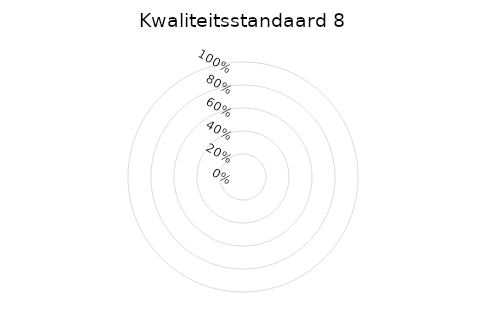
| Category | 8a | 8b | 8d | 8e | 8f | 8g | 8h | 8i | 8j |
|---|---|---|---|---|---|---|---|---|---|
| 0.0 | 0 | 0 | 0 | 0 | 0 | 0 | 0 | 0 | 0 |
| 1.0 | 0 | 0 | 0 | 0 | 0 | 0 | 0 | 0 | 0 |
| 2.0 | 0 | 0 | 0 | 0 | 0 | 0 | 0 | 0 | 0 |
| 3.0 | 0 | 0 | 0 | 0 | 0 | 0 | 0 | 0 | 0 |
| 4.0 | 0 | 0 | 0 | 0 | 0 | 0 | 0 | 0 | 0 |
| 5.0 | 0 | 0 | 0 | 0 | 0 | 0 | 0 | 0 | 0 |
| 6.0 | 0 | 0 | 0 | 0 | 0 | 0 | 0 | 0 | 0 |
| 7.0 | 0 | 0 | 0 | 0 | 0 | 0 | 0 | 0 | 0 |
| 8.0 | 0 | 0 | 0 | 0 | 0 | 0 | 0 | 0 | 0 |
| 9.0 | 0 | 0 | 0 | 0 | 0 | 0 | 0 | 0 | 0 |
| 10.0 | 0 | 0 | 0 | 0 | 0 | 0 | 0 | 0 | 0 |
| 11.0 | 0 | 0 | 0 | 0 | 0 | 0 | 0 | 0 | 0 |
| 12.0 | 0 | 0 | 0 | 0 | 0 | 0 | 0 | 0 | 0 |
| 13.0 | 0 | 0 | 0 | 0 | 0 | 0 | 0 | 0 | 0 |
| 14.0 | 0 | 0 | 0 | 0 | 0 | 0 | 0 | 0 | 0 |
| 15.0 | 0 | 0 | 0 | 0 | 0 | 0 | 0 | 0 | 0 |
| 16.0 | 0 | 0 | 0 | 0 | 0 | 0 | 0 | 0 | 0 |
| 17.0 | 0 | 0 | 0 | 0 | 0 | 0 | 0 | 0 | 0 |
| 18.0 | 0 | 0 | 0 | 0 | 0 | 0 | 0 | 0 | 0 |
| 19.0 | 0 | 0 | 0 | 0 | 0 | 0 | 0 | 0 | 0 |
| 20.0 | 0 | 0 | 0 | 0 | 0 | 0 | 0 | 0 | 0 |
| 21.0 | 0 | 0 | 0 | 0 | 0 | 0 | 0 | 0 | 0 |
| 22.0 | 0 | 0 | 0 | 0 | 0 | 0 | 0 | 0 | 0 |
| 23.0 | 0 | 0 | 0 | 0 | 0 | 0 | 0 | 0 | 0 |
| 24.0 | 0 | 0 | 0 | 0 | 0 | 0 | 0 | 0 | 0 |
| 25.0 | 0 | 0 | 0 | 0 | 0 | 0 | 0 | 0 | 0 |
| 26.0 | 0 | 0 | 0 | 0 | 0 | 0 | 0 | 0 | 0 |
| 27.0 | 0 | 0 | 0 | 0 | 0 | 0 | 0 | 0 | 0 |
| 28.0 | 0 | 0 | 0 | 0 | 0 | 0 | 0 | 0 | 0 |
| 29.0 | 0 | 0 | 0 | 0 | 0 | 0 | 0 | 0 | 0 |
| 30.0 | 0 | 0 | 0 | 0 | 0 | 0 | 0 | 0 | 0 |
| 31.0 | 0 | 0 | 0 | 0 | 0 | 0 | 0 | 0 | 0 |
| 32.0 | 0 | 0 | 0 | 0 | 0 | 0 | 0 | 0 | 0 |
| 33.0 | 0 | 0 | 0 | 0 | 0 | 0 | 0 | 0 | 0 |
| 34.0 | 0 | 0 | 0 | 0 | 0 | 0 | 0 | 0 | 0 |
| 35.0 | 0 | 0 | 0 | 0 | 0 | 0 | 0 | 0 | 0 |
| 36.0 | 0 | 0 | 0 | 0 | 0 | 0 | 0 | 0 | 0 |
| 37.0 | 0 | 0 | 0 | 0 | 0 | 0 | 0 | 0 | 0 |
| 38.0 | 0 | 0 | 0 | 0 | 0 | 0 | 0 | 0 | 0 |
| 39.0 | 0 | 0 | 0 | 0 | 0 | 0 | 0 | 0 | 0 |
| 40.0 | 0 | 0 | 0 | 0 | 0 | 0 | 0 | 0 | 0 |
| 41.0 | 0 | 0 | 0 | 0 | 0 | 0 | 0 | 0 | 0 |
| 42.0 | 0 | 0 | 0 | 0 | 0 | 0 | 0 | 0 | 0 |
| 43.0 | 0 | 0 | 0 | 0 | 0 | 0 | 0 | 0 | 0 |
| 44.0 | 0 | 0 | 0 | 0 | 0 | 0 | 0 | 0 | 0 |
| 45.0 | 0 | 0 | 0 | 0 | 0 | 0 | 0 | 0 | 0 |
| 46.0 | 0 | 0 | 0 | 0 | 0 | 0 | 0 | 0 | 0 |
| 47.0 | 0 | 0 | 0 | 0 | 0 | 0 | 0 | 0 | 0 |
| 48.0 | 0 | 0 | 0 | 0 | 0 | 0 | 0 | 0 | 0 |
| 49.0 | 0 | 0 | 0 | 0 | 0 | 0 | 0 | 0 | 0 |
| 50.0 | 0 | 0 | 0 | 0 | 0 | 0 | 0 | 0 | 0 |
| 51.0 | 0 | 0 | 0 | 0 | 0 | 0 | 0 | 0 | 0 |
| 52.0 | 0 | 0 | 0 | 0 | 0 | 0 | 0 | 0 | 0 |
| 53.0 | 0 | 0 | 0 | 0 | 0 | 0 | 0 | 0 | 0 |
| 54.0 | 0 | 0 | 0 | 0 | 0 | 0 | 0 | 0 | 0 |
| 55.0 | 0 | 0 | 0 | 0 | 0 | 0 | 0 | 0 | 0 |
| 56.0 | 0 | 0 | 0 | 0 | 0 | 0 | 0 | 0 | 0 |
| 57.0 | 0 | 0 | 0 | 0 | 0 | 0 | 0 | 0 | 0 |
| 58.0 | 0 | 0 | 0 | 0 | 0 | 0 | 0 | 0 | 0 |
| 59.0 | 0 | 0 | 0 | 0 | 0 | 0 | 0 | 0 | 0 |
| 60.0 | 0 | 0 | 0 | 0 | 0 | 0 | 0 | 0 | 0 |
| 61.0 | 0 | 0 | 0 | 0 | 0 | 0 | 0 | 0 | 0 |
| 62.0 | 0 | 0 | 0 | 0 | 0 | 0 | 0 | 0 | 0 |
| 63.0 | 0 | 0 | 0 | 0 | 0 | 0 | 0 | 0 | 0 |
| 64.0 | 0 | 0 | 0 | 0 | 0 | 0 | 0 | 0 | 0 |
| 65.0 | 0 | 0 | 0 | 0 | 0 | 0 | 0 | 0 | 0 |
| 66.0 | 0 | 0 | 0 | 0 | 0 | 0 | 0 | 0 | 0 |
| 67.0 | 0 | 0 | 0 | 0 | 0 | 0 | 0 | 0 | 0 |
| 68.0 | 0 | 0 | 0 | 0 | 0 | 0 | 0 | 0 | 0 |
| 69.0 | 0 | 0 | 0 | 0 | 0 | 0 | 0 | 0 | 0 |
| 70.0 | 0 | 0 | 0 | 0 | 0 | 0 | 0 | 0 | 0 |
| 71.0 | 0 | 0 | 0 | 0 | 0 | 0 | 0 | 0 | 0 |
| 72.0 | 0 | 0 | 0 | 0 | 0 | 0 | 0 | 0 | 0 |
| 73.0 | 0 | 0 | 0 | 0 | 0 | 0 | 0 | 0 | 0 |
| 74.0 | 0 | 0 | 0 | 0 | 0 | 0 | 0 | 0 | 0 |
| 75.0 | 0 | 0 | 0 | 0 | 0 | 0 | 0 | 0 | 0 |
| 76.0 | 0 | 0 | 0 | 0 | 0 | 0 | 0 | 0 | 0 |
| 77.0 | 0 | 0 | 0 | 0 | 0 | 0 | 0 | 0 | 0 |
| 78.0 | 0 | 0 | 0 | 0 | 0 | 0 | 0 | 0 | 0 |
| 79.0 | 0 | 0 | 0 | 0 | 0 | 0 | 0 | 0 | 0 |
| 80.0 | 0 | 0 | 0 | 0 | 0 | 0 | 0 | 0 | 0 |
| 81.0 | 0 | 0 | 0 | 0 | 0 | 0 | 0 | 0 | 0 |
| 82.0 | 0 | 0 | 0 | 0 | 0 | 0 | 0 | 0 | 0 |
| 83.0 | 0 | 0 | 0 | 0 | 0 | 0 | 0 | 0 | 0 |
| 84.0 | 0 | 0 | 0 | 0 | 0 | 0 | 0 | 0 | 0 |
| 85.0 | 0 | 0 | 0 | 0 | 0 | 0 | 0 | 0 | 0 |
| 86.0 | 0 | 0 | 0 | 0 | 0 | 0 | 0 | 0 | 0 |
| 87.0 | 0 | 0 | 0 | 0 | 0 | 0 | 0 | 0 | 0 |
| 88.0 | 0 | 0 | 0 | 0 | 0 | 0 | 0 | 0 | 0 |
| 89.0 | 0 | 0 | 0 | 0 | 0 | 0 | 0 | 0 | 0 |
| 90.0 | 0 | 0 | 0 | 0 | 0 | 0 | 0 | 0 | 0 |
| 91.0 | 0 | 0 | 0 | 0 | 0 | 0 | 0 | 0 | 0 |
| 92.0 | 0 | 0 | 0 | 0 | 0 | 0 | 0 | 0 | 0 |
| 93.0 | 0 | 0 | 0 | 0 | 0 | 0 | 0 | 0 | 0 |
| 94.0 | 0 | 0 | 0 | 0 | 0 | 0 | 0 | 0 | 0 |
| 95.0 | 0 | 0 | 0 | 0 | 0 | 0 | 0 | 0 | 0 |
| 96.0 | 0 | 0 | 0 | 0 | 0 | 0 | 0 | 0 | 0 |
| 97.0 | 0 | 0 | 0 | 0 | 0 | 0 | 0 | 0 | 0 |
| 98.0 | 0 | 0 | 0 | 0 | 0 | 0 | 0 | 0 | 0 |
| 99.0 | 0 | 0 | 0 | 0 | 0 | 0 | 0 | 0 | 0 |
| 100.0 | 0 | 0 | 0 | 0 | 0 | 0 | 0 | 0 | 0 |
| 101.0 | 0 | 0 | 0 | 0 | 0 | 0 | 0 | 0 | 0 |
| 102.0 | 0 | 0 | 0 | 0 | 0 | 0 | 0 | 0 | 0 |
| 103.0 | 0 | 0 | 0 | 0 | 0 | 0 | 0 | 0 | 0 |
| 104.0 | 0 | 0 | 0 | 0 | 0 | 0 | 0 | 0 | 0 |
| 105.0 | 0 | 0 | 0 | 0 | 0 | 0 | 0 | 0 | 0 |
| 106.0 | 0 | 0 | 0 | 0 | 0 | 0 | 0 | 0 | 0 |
| 107.0 | 0 | 0 | 0 | 0 | 0 | 0 | 0 | 0 | 0 |
| 108.0 | 0 | 0 | 0 | 0 | 0 | 0 | 0 | 0 | 0 |
| 109.0 | 0 | 0 | 0 | 0 | 0 | 0 | 0 | 0 | 0 |
| 110.0 | 0 | 0 | 0 | 0 | 0 | 0 | 0 | 0 | 0 |
| 111.0 | 0 | 0 | 0 | 0 | 0 | 0 | 0 | 0 | 0 |
| 112.0 | 0 | 0 | 0 | 0 | 0 | 0 | 0 | 0 | 0 |
| 113.0 | 0 | 0 | 0 | 0 | 0 | 0 | 0 | 0 | 0 |
| 114.0 | 0 | 0 | 0 | 0 | 0 | 0 | 0 | 0 | 0 |
| 115.0 | 0 | 0 | 0 | 0 | 0 | 0 | 0 | 0 | 0 |
| 116.0 | 0 | 0 | 0 | 0 | 0 | 0 | 0 | 0 | 0 |
| 117.0 | 0 | 0 | 0 | 0 | 0 | 0 | 0 | 0 | 0 |
| 118.0 | 0 | 0 | 0 | 0 | 0 | 0 | 0 | 0 | 0 |
| 119.0 | 0 | 0 | 0 | 0 | 0 | 0 | 0 | 0 | 0 |
| 120.0 | 0 | 0 | 0 | 0 | 0 | 0 | 0 | 0 | 0 |
| 121.0 | 0 | 0 | 0 | 0 | 0 | 0 | 0 | 0 | 0 |
| 122.0 | 0 | 0 | 0 | 0 | 0 | 0 | 0 | 0 | 0 |
| 123.0 | 0 | 0 | 0 | 0 | 0 | 0 | 0 | 0 | 0 |
| 124.0 | 0 | 0 | 0 | 0 | 0 | 0 | 0 | 0 | 0 |
| 125.0 | 0 | 0 | 0 | 0 | 0 | 0 | 0 | 0 | 0 |
| 126.0 | 0 | 0 | 0 | 0 | 0 | 0 | 0 | 0 | 0 |
| 127.0 | 0 | 0 | 0 | 0 | 0 | 0 | 0 | 0 | 0 |
| 128.0 | 0 | 0 | 0 | 0 | 0 | 0 | 0 | 0 | 0 |
| 129.0 | 0 | 0 | 0 | 0 | 0 | 0 | 0 | 0 | 0 |
| 130.0 | 0 | 0 | 0 | 0 | 0 | 0 | 0 | 0 | 0 |
| 131.0 | 0 | 0 | 0 | 0 | 0 | 0 | 0 | 0 | 0 |
| 132.0 | 0 | 0 | 0 | 0 | 0 | 0 | 0 | 0 | 0 |
| 133.0 | 0 | 0 | 0 | 0 | 0 | 0 | 0 | 0 | 0 |
| 134.0 | 0 | 0 | 0 | 0 | 0 | 0 | 0 | 0 | 0 |
| 135.0 | 0 | 0 | 0 | 0 | 0 | 0 | 0 | 0 | 0 |
| 136.0 | 0 | 0 | 0 | 0 | 0 | 0 | 0 | 0 | 0 |
| 137.0 | 0 | 0 | 0 | 0 | 0 | 0 | 0 | 0 | 0 |
| 138.0 | 0 | 0 | 0 | 0 | 0 | 0 | 0 | 0 | 0 |
| 139.0 | 0 | 0 | 0 | 0 | 0 | 0 | 0 | 0 | 0 |
| 140.0 | 0 | 0 | 0 | 0 | 0 | 0 | 0 | 0 | 0 |
| 141.0 | 0 | 0 | 0 | 0 | 0 | 0 | 0 | 0 | 0 |
| 142.0 | 0 | 0 | 0 | 0 | 0 | 0 | 0 | 0 | 0 |
| 143.0 | 0 | 0 | 0 | 0 | 0 | 0 | 0 | 0 | 0 |
| 144.0 | 0 | 0 | 0 | 0 | 0 | 0 | 0 | 0 | 0 |
| 145.0 | 0 | 0 | 0 | 0 | 0 | 0 | 0 | 0 | 0 |
| 146.0 | 0 | 0 | 0 | 0 | 0 | 0 | 0 | 0 | 0 |
| 147.0 | 0 | 0 | 0 | 0 | 0 | 0 | 0 | 0 | 0 |
| 148.0 | 0 | 0 | 0 | 0 | 0 | 0 | 0 | 0 | 0 |
| 149.0 | 0 | 0 | 0 | 0 | 0 | 0 | 0 | 0 | 0 |
| 150.0 | 0 | 0 | 0 | 0 | 0 | 0 | 0 | 0 | 0 |
| 151.0 | 0 | 0 | 0 | 0 | 0 | 0 | 0 | 0 | 0 |
| 152.0 | 0 | 0 | 0 | 0 | 0 | 0 | 0 | 0 | 0 |
| 153.0 | 0 | 0 | 0 | 0 | 0 | 0 | 0 | 0 | 0 |
| 154.0 | 0 | 0 | 0 | 0 | 0 | 0 | 0 | 0 | 0 |
| 155.0 | 0 | 0 | 0 | 0 | 0 | 0 | 0 | 0 | 0 |
| 156.0 | 0 | 0 | 0 | 0 | 0 | 0 | 0 | 0 | 0 |
| 157.0 | 0 | 0 | 0 | 0 | 0 | 0 | 0 | 0 | 0 |
| 158.0 | 0 | 0 | 0 | 0 | 0 | 0 | 0 | 0 | 0 |
| 159.0 | 0 | 0 | 0 | 0 | 0 | 0 | 0 | 0 | 0 |
| 160.0 | 0 | 0 | 0 | 0 | 0 | 0 | 0 | 0 | 0 |
| 161.0 | 0 | 0 | 0 | 0 | 0 | 0 | 0 | 0 | 0 |
| 162.0 | 0 | 0 | 0 | 0 | 0 | 0 | 0 | 0 | 0 |
| 163.0 | 0 | 0 | 0 | 0 | 0 | 0 | 0 | 0 | 0 |
| 164.0 | 0 | 0 | 0 | 0 | 0 | 0 | 0 | 0 | 0 |
| 165.0 | 0 | 0 | 0 | 0 | 0 | 0 | 0 | 0 | 0 |
| 166.0 | 0 | 0 | 0 | 0 | 0 | 0 | 0 | 0 | 0 |
| 167.0 | 0 | 0 | 0 | 0 | 0 | 0 | 0 | 0 | 0 |
| 168.0 | 0 | 0 | 0 | 0 | 0 | 0 | 0 | 0 | 0 |
| 169.0 | 0 | 0 | 0 | 0 | 0 | 0 | 0 | 0 | 0 |
| 170.0 | 0 | 0 | 0 | 0 | 0 | 0 | 0 | 0 | 0 |
| 171.0 | 0 | 0 | 0 | 0 | 0 | 0 | 0 | 0 | 0 |
| 172.0 | 0 | 0 | 0 | 0 | 0 | 0 | 0 | 0 | 0 |
| 173.0 | 0 | 0 | 0 | 0 | 0 | 0 | 0 | 0 | 0 |
| 174.0 | 0 | 0 | 0 | 0 | 0 | 0 | 0 | 0 | 0 |
| 175.0 | 0 | 0 | 0 | 0 | 0 | 0 | 0 | 0 | 0 |
| 176.0 | 0 | 0 | 0 | 0 | 0 | 0 | 0 | 0 | 0 |
| 177.0 | 0 | 0 | 0 | 0 | 0 | 0 | 0 | 0 | 0 |
| 178.0 | 0 | 0 | 0 | 0 | 0 | 0 | 0 | 0 | 0 |
| 179.0 | 0 | 0 | 0 | 0 | 0 | 0 | 0 | 0 | 0 |
| 180.0 | 0 | 0 | 0 | 0 | 0 | 0 | 0 | 0 | 0 |
| 181.0 | 0 | 0 | 0 | 0 | 0 | 0 | 0 | 0 | 0 |
| 182.0 | 0 | 0 | 0 | 0 | 0 | 0 | 0 | 0 | 0 |
| 183.0 | 0 | 0 | 0 | 0 | 0 | 0 | 0 | 0 | 0 |
| 184.0 | 0 | 0 | 0 | 0 | 0 | 0 | 0 | 0 | 0 |
| 185.0 | 0 | 0 | 0 | 0 | 0 | 0 | 0 | 0 | 0 |
| 186.0 | 0 | 0 | 0 | 0 | 0 | 0 | 0 | 0 | 0 |
| 187.0 | 0 | 0 | 0 | 0 | 0 | 0 | 0 | 0 | 0 |
| 188.0 | 0 | 0 | 0 | 0 | 0 | 0 | 0 | 0 | 0 |
| 189.0 | 0 | 0 | 0 | 0 | 0 | 0 | 0 | 0 | 0 |
| 190.0 | 0 | 0 | 0 | 0 | 0 | 0 | 0 | 0 | 0 |
| 191.0 | 0 | 0 | 0 | 0 | 0 | 0 | 0 | 0 | 0 |
| 192.0 | 0 | 0 | 0 | 0 | 0 | 0 | 0 | 0 | 0 |
| 193.0 | 0 | 0 | 0 | 0 | 0 | 0 | 0 | 0 | 0 |
| 194.0 | 0 | 0 | 0 | 0 | 0 | 0 | 0 | 0 | 0 |
| 195.0 | 0 | 0 | 0 | 0 | 0 | 0 | 0 | 0 | 0 |
| 196.0 | 0 | 0 | 0 | 0 | 0 | 0 | 0 | 0 | 0 |
| 197.0 | 0 | 0 | 0 | 0 | 0 | 0 | 0 | 0 | 0 |
| 198.0 | 0 | 0 | 0 | 0 | 0 | 0 | 0 | 0 | 0 |
| 199.0 | 0 | 0 | 0 | 0 | 0 | 0 | 0 | 0 | 0 |
| 200.0 | 0 | 0 | 0 | 0 | 0 | 0 | 0 | 0 | 0 |
| 201.0 | 0 | 0 | 0 | 0 | 0 | 0 | 0 | 0 | 0 |
| 202.0 | 0 | 0 | 0 | 0 | 0 | 0 | 0 | 0 | 0 |
| 203.0 | 0 | 0 | 0 | 0 | 0 | 0 | 0 | 0 | 0 |
| 204.0 | 0 | 0 | 0 | 0 | 0 | 0 | 0 | 0 | 0 |
| 205.0 | 0 | 0 | 0 | 0 | 0 | 0 | 0 | 0 | 0 |
| 206.0 | 0 | 0 | 0 | 0 | 0 | 0 | 0 | 0 | 0 |
| 207.0 | 0 | 0 | 0 | 0 | 0 | 0 | 0 | 0 | 0 |
| 208.0 | 0 | 0 | 0 | 0 | 0 | 0 | 0 | 0 | 0 |
| 209.0 | 0 | 0 | 0 | 0 | 0 | 0 | 0 | 0 | 0 |
| 210.0 | 0 | 0 | 0 | 0 | 0 | 0 | 0 | 0 | 0 |
| 211.0 | 0 | 0 | 0 | 0 | 0 | 0 | 0 | 0 | 0 |
| 212.0 | 0 | 0 | 0 | 0 | 0 | 0 | 0 | 0 | 0 |
| 213.0 | 0 | 0 | 0 | 0 | 0 | 0 | 0 | 0 | 0 |
| 214.0 | 0 | 0 | 0 | 0 | 0 | 0 | 0 | 0 | 0 |
| 215.0 | 0 | 0 | 0 | 0 | 0 | 0 | 0 | 0 | 0 |
| 216.0 | 0 | 0 | 0 | 0 | 0 | 0 | 0 | 0 | 0 |
| 217.0 | 0 | 0 | 0 | 0 | 0 | 0 | 0 | 0 | 0 |
| 218.0 | 0 | 0 | 0 | 0 | 0 | 0 | 0 | 0 | 0 |
| 219.0 | 0 | 0 | 0 | 0 | 0 | 0 | 0 | 0 | 0 |
| 220.0 | 0 | 0 | 0 | 0 | 0 | 0 | 0 | 0 | 0 |
| 221.0 | 0 | 0 | 0 | 0 | 0 | 0 | 0 | 0 | 0 |
| 222.0 | 0 | 0 | 0 | 0 | 0 | 0 | 0 | 0 | 0 |
| 223.0 | 0 | 0 | 0 | 0 | 0 | 0 | 0 | 0 | 0 |
| 224.0 | 0 | 0 | 0 | 0 | 0 | 0 | 0 | 0 | 0 |
| 225.0 | 0 | 0 | 0 | 0 | 0 | 0 | 0 | 0 | 0 |
| 226.0 | 0 | 0 | 0 | 0 | 0 | 0 | 0 | 0 | 0 |
| 227.0 | 0 | 0 | 0 | 0 | 0 | 0 | 0 | 0 | 0 |
| 228.0 | 0 | 0 | 0 | 0 | 0 | 0 | 0 | 0 | 0 |
| 229.0 | 0 | 0 | 0 | 0 | 0 | 0 | 0 | 0 | 0 |
| 230.0 | 0 | 0 | 0 | 0 | 0 | 0 | 0 | 0 | 0 |
| 231.0 | 0 | 0 | 0 | 0 | 0 | 0 | 0 | 0 | 0 |
| 232.0 | 0 | 0 | 0 | 0 | 0 | 0 | 0 | 0 | 0 |
| 233.0 | 0 | 0 | 0 | 0 | 0 | 0 | 0 | 0 | 0 |
| 234.0 | 0 | 0 | 0 | 0 | 0 | 0 | 0 | 0 | 0 |
| 235.0 | 0 | 0 | 0 | 0 | 0 | 0 | 0 | 0 | 0 |
| 236.0 | 0 | 0 | 0 | 0 | 0 | 0 | 0 | 0 | 0 |
| 237.0 | 0 | 0 | 0 | 0 | 0 | 0 | 0 | 0 | 0 |
| 238.0 | 0 | 0 | 0 | 0 | 0 | 0 | 0 | 0 | 0 |
| 239.0 | 0 | 0 | 0 | 0 | 0 | 0 | 0 | 0 | 0 |
| 240.0 | 0 | 0 | 0 | 0 | 0 | 0 | 0 | 0 | 0 |
| 241.0 | 0 | 0 | 0 | 0 | 0 | 0 | 0 | 0 | 0 |
| 242.0 | 0 | 0 | 0 | 0 | 0 | 0 | 0 | 0 | 0 |
| 243.0 | 0 | 0 | 0 | 0 | 0 | 0 | 0 | 0 | 0 |
| 244.0 | 0 | 0 | 0 | 0 | 0 | 0 | 0 | 0 | 0 |
| 245.0 | 0 | 0 | 0 | 0 | 0 | 0 | 0 | 0 | 0 |
| 246.0 | 0 | 0 | 0 | 0 | 0 | 0 | 0 | 0 | 0 |
| 247.0 | 0 | 0 | 0 | 0 | 0 | 0 | 0 | 0 | 0 |
| 248.0 | 0 | 0 | 0 | 0 | 0 | 0 | 0 | 0 | 0 |
| 249.0 | 0 | 0 | 0 | 0 | 0 | 0 | 0 | 0 | 0 |
| 250.0 | 0 | 0 | 0 | 0 | 0 | 0 | 0 | 0 | 0 |
| 251.0 | 0 | 0 | 0 | 0 | 0 | 0 | 0 | 0 | 0 |
| 252.0 | 0 | 0 | 0 | 0 | 0 | 0 | 0 | 0 | 0 |
| 253.0 | 0 | 0 | 0 | 0 | 0 | 0 | 0 | 0 | 0 |
| 254.0 | 0 | 0 | 0 | 0 | 0 | 0 | 0 | 0 | 0 |
| 255.0 | 0 | 0 | 0 | 0 | 0 | 0 | 0 | 0 | 0 |
| 256.0 | 0 | 0 | 0 | 0 | 0 | 0 | 0 | 0 | 0 |
| 257.0 | 0 | 0 | 0 | 0 | 0 | 0 | 0 | 0 | 0 |
| 258.0 | 0 | 0 | 0 | 0 | 0 | 0 | 0 | 0 | 0 |
| 259.0 | 0 | 0 | 0 | 0 | 0 | 0 | 0 | 0 | 0 |
| 260.0 | 0 | 0 | 0 | 0 | 0 | 0 | 0 | 0 | 0 |
| 261.0 | 0 | 0 | 0 | 0 | 0 | 0 | 0 | 0 | 0 |
| 262.0 | 0 | 0 | 0 | 0 | 0 | 0 | 0 | 0 | 0 |
| 263.0 | 0 | 0 | 0 | 0 | 0 | 0 | 0 | 0 | 0 |
| 264.0 | 0 | 0 | 0 | 0 | 0 | 0 | 0 | 0 | 0 |
| 265.0 | 0 | 0 | 0 | 0 | 0 | 0 | 0 | 0 | 0 |
| 266.0 | 0 | 0 | 0 | 0 | 0 | 0 | 0 | 0 | 0 |
| 267.0 | 0 | 0 | 0 | 0 | 0 | 0 | 0 | 0 | 0 |
| 268.0 | 0 | 0 | 0 | 0 | 0 | 0 | 0 | 0 | 0 |
| 269.0 | 0 | 0 | 0 | 0 | 0 | 0 | 0 | 0 | 0 |
| 270.0 | 0 | 0 | 0 | 0 | 0 | 0 | 0 | 0 | 0 |
| 271.0 | 0 | 0 | 0 | 0 | 0 | 0 | 0 | 0 | 0 |
| 272.0 | 0 | 0 | 0 | 0 | 0 | 0 | 0 | 0 | 0 |
| 273.0 | 0 | 0 | 0 | 0 | 0 | 0 | 0 | 0 | 0 |
| 274.0 | 0 | 0 | 0 | 0 | 0 | 0 | 0 | 0 | 0 |
| 275.0 | 0 | 0 | 0 | 0 | 0 | 0 | 0 | 0 | 0 |
| 276.0 | 0 | 0 | 0 | 0 | 0 | 0 | 0 | 0 | 0 |
| 277.0 | 0 | 0 | 0 | 0 | 0 | 0 | 0 | 0 | 0 |
| 278.0 | 0 | 0 | 0 | 0 | 0 | 0 | 0 | 0 | 0 |
| 279.0 | 0 | 0 | 0 | 0 | 0 | 0 | 0 | 0 | 0 |
| 280.0 | 0 | 0 | 0 | 0 | 0 | 0 | 0 | 0 | 0 |
| 281.0 | 0 | 0 | 0 | 0 | 0 | 0 | 0 | 0 | 0 |
| 282.0 | 0 | 0 | 0 | 0 | 0 | 0 | 0 | 0 | 0 |
| 283.0 | 0 | 0 | 0 | 0 | 0 | 0 | 0 | 0 | 0 |
| 284.0 | 0 | 0 | 0 | 0 | 0 | 0 | 0 | 0 | 0 |
| 285.0 | 0 | 0 | 0 | 0 | 0 | 0 | 0 | 0 | 0 |
| 286.0 | 0 | 0 | 0 | 0 | 0 | 0 | 0 | 0 | 0 |
| 287.0 | 0 | 0 | 0 | 0 | 0 | 0 | 0 | 0 | 0 |
| 288.0 | 0 | 0 | 0 | 0 | 0 | 0 | 0 | 0 | 0 |
| 289.0 | 0 | 0 | 0 | 0 | 0 | 0 | 0 | 0 | 0 |
| 290.0 | 0 | 0 | 0 | 0 | 0 | 0 | 0 | 0 | 0 |
| 291.0 | 0 | 0 | 0 | 0 | 0 | 0 | 0 | 0 | 0 |
| 292.0 | 0 | 0 | 0 | 0 | 0 | 0 | 0 | 0 | 0 |
| 293.0 | 0 | 0 | 0 | 0 | 0 | 0 | 0 | 0 | 0 |
| 294.0 | 0 | 0 | 0 | 0 | 0 | 0 | 0 | 0 | 0 |
| 295.0 | 0 | 0 | 0 | 0 | 0 | 0 | 0 | 0 | 0 |
| 296.0 | 0 | 0 | 0 | 0 | 0 | 0 | 0 | 0 | 0 |
| 297.0 | 0 | 0 | 0 | 0 | 0 | 0 | 0 | 0 | 0 |
| 298.0 | 0 | 0 | 0 | 0 | 0 | 0 | 0 | 0 | 0 |
| 299.0 | 0 | 0 | 0 | 0 | 0 | 0 | 0 | 0 | 0 |
| 300.0 | 0 | 0 | 0 | 0 | 0 | 0 | 0 | 0 | 0 |
| 301.0 | 0 | 0 | 0 | 0 | 0 | 0 | 0 | 0 | 0 |
| 302.0 | 0 | 0 | 0 | 0 | 0 | 0 | 0 | 0 | 0 |
| 303.0 | 0 | 0 | 0 | 0 | 0 | 0 | 0 | 0 | 0 |
| 304.0 | 0 | 0 | 0 | 0 | 0 | 0 | 0 | 0 | 0 |
| 305.0 | 0 | 0 | 0 | 0 | 0 | 0 | 0 | 0 | 0 |
| 306.0 | 0 | 0 | 0 | 0 | 0 | 0 | 0 | 0 | 0 |
| 307.0 | 0 | 0 | 0 | 0 | 0 | 0 | 0 | 0 | 0 |
| 308.0 | 0 | 0 | 0 | 0 | 0 | 0 | 0 | 0 | 0 |
| 309.0 | 0 | 0 | 0 | 0 | 0 | 0 | 0 | 0 | 0 |
| 310.0 | 0 | 0 | 0 | 0 | 0 | 0 | 0 | 0 | 0 |
| 311.0 | 0 | 0 | 0 | 0 | 0 | 0 | 0 | 0 | 0 |
| 312.0 | 0 | 0 | 0 | 0 | 0 | 0 | 0 | 0 | 0 |
| 313.0 | 0 | 0 | 0 | 0 | 0 | 0 | 0 | 0 | 0 |
| 314.0 | 0 | 0 | 0 | 0 | 0 | 0 | 0 | 0 | 0 |
| 315.0 | 0 | 0 | 0 | 0 | 0 | 0 | 0 | 0 | 0 |
| 316.0 | 0 | 0 | 0 | 0 | 0 | 0 | 0 | 0 | 0 |
| 317.0 | 0 | 0 | 0 | 0 | 0 | 0 | 0 | 0 | 0 |
| 318.0 | 0 | 0 | 0 | 0 | 0 | 0 | 0 | 0 | 0 |
| 319.0 | 0 | 0 | 0 | 0 | 0 | 0 | 0 | 0 | 0 |
| 320.0 | 0 | 0 | 0 | 0 | 0 | 0 | 0 | 0 | 0 |
| 321.0 | 0 | 0 | 0 | 0 | 0 | 0 | 0 | 0 | 0 |
| 322.0 | 0 | 0 | 0 | 0 | 0 | 0 | 0 | 0 | 0 |
| 323.0 | 0 | 0 | 0 | 0 | 0 | 0 | 0 | 0 | 0 |
| 324.0 | 0 | 0 | 0 | 0 | 0 | 0 | 0 | 0 | 0 |
| 325.0 | 0 | 0 | 0 | 0 | 0 | 0 | 0 | 0 | 0 |
| 326.0 | 0 | 0 | 0 | 0 | 0 | 0 | 0 | 0 | 0 |
| 327.0 | 0 | 0 | 0 | 0 | 0 | 0 | 0 | 0 | 0 |
| 328.0 | 0 | 0 | 0 | 0 | 0 | 0 | 0 | 0 | 0 |
| 329.0 | 0 | 0 | 0 | 0 | 0 | 0 | 0 | 0 | 0 |
| 330.0 | 0 | 0 | 0 | 0 | 0 | 0 | 0 | 0 | 0 |
| 331.0 | 0 | 0 | 0 | 0 | 0 | 0 | 0 | 0 | 0 |
| 332.0 | 0 | 0 | 0 | 0 | 0 | 0 | 0 | 0 | 0 |
| 333.0 | 0 | 0 | 0 | 0 | 0 | 0 | 0 | 0 | 0 |
| 334.0 | 0 | 0 | 0 | 0 | 0 | 0 | 0 | 0 | 0 |
| 335.0 | 0 | 0 | 0 | 0 | 0 | 0 | 0 | 0 | 0 |
| 336.0 | 0 | 0 | 0 | 0 | 0 | 0 | 0 | 0 | 0 |
| 337.0 | 0 | 0 | 0 | 0 | 0 | 0 | 0 | 0 | 0 |
| 338.0 | 0 | 0 | 0 | 0 | 0 | 0 | 0 | 0 | 0 |
| 339.0 | 0 | 0 | 0 | 0 | 0 | 0 | 0 | 0 | 0 |
| 340.0 | 0 | 0 | 0 | 0 | 0 | 0 | 0 | 0 | 0 |
| 341.0 | 0 | 0 | 0 | 0 | 0 | 0 | 0 | 0 | 0 |
| 342.0 | 0 | 0 | 0 | 0 | 0 | 0 | 0 | 0 | 0 |
| 343.0 | 0 | 0 | 0 | 0 | 0 | 0 | 0 | 0 | 0 |
| 344.0 | 0 | 0 | 0 | 0 | 0 | 0 | 0 | 0 | 0 |
| 345.0 | 0 | 0 | 0 | 0 | 0 | 0 | 0 | 0 | 0 |
| 346.0 | 0 | 0 | 0 | 0 | 0 | 0 | 0 | 0 | 0 |
| 347.0 | 0 | 0 | 0 | 0 | 0 | 0 | 0 | 0 | 0 |
| 348.0 | 0 | 0 | 0 | 0 | 0 | 0 | 0 | 0 | 0 |
| 349.0 | 0 | 0 | 0 | 0 | 0 | 0 | 0 | 0 | 0 |
| 350.0 | 0 | 0 | 0 | 0 | 0 | 0 | 0 | 0 | 0 |
| 351.0 | 0 | 0 | 0 | 0 | 0 | 0 | 0 | 0 | 0 |
| 352.0 | 0 | 0 | 0 | 0 | 0 | 0 | 0 | 0 | 0 |
| 353.0 | 0 | 0 | 0 | 0 | 0 | 0 | 0 | 0 | 0 |
| 354.0 | 0 | 0 | 0 | 0 | 0 | 0 | 0 | 0 | 0 |
| 355.0 | 0 | 0 | 0 | 0 | 0 | 0 | 0 | 0 | 0 |
| 356.0 | 0 | 0 | 0 | 0 | 0 | 0 | 0 | 0 | 0 |
| 357.0 | 0 | 0 | 0 | 0 | 0 | 0 | 0 | 0 | 0 |
| 358.0 | 0 | 0 | 0 | 0 | 0 | 0 | 0 | 0 | 0 |
| 359.0 | 0 | 0 | 0 | 0 | 0 | 0 | 0 | 0 | 0 |
| 360.0 | 0 | 0 | 0 | 0 | 0 | 0 | 0 | 0 | 0 |